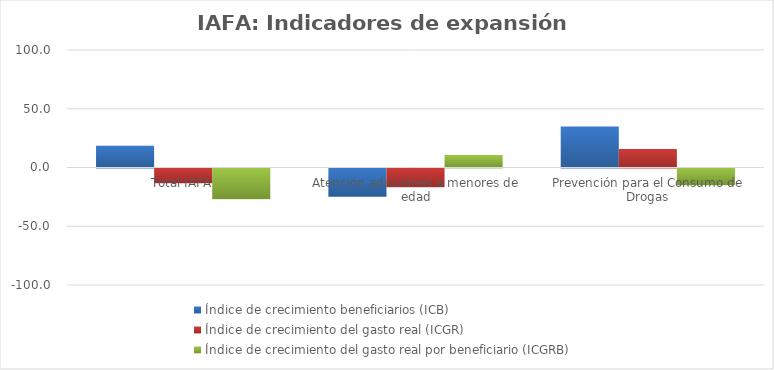
| Category | Índice de crecimiento beneficiarios (ICB)  | Índice de crecimiento del gasto real (ICGR)  | Índice de crecimiento del gasto real por beneficiario (ICGRB)  |
|---|---|---|---|
| Total IAFA | 18.498 | -12.49 | -26.15 |
| Atención adicciones a menores de edad | -24.086 | -15.946 | 10.722 |
| Prevención para el Consumo de Drogas | 34.923 | 15.817 | -14.161 |